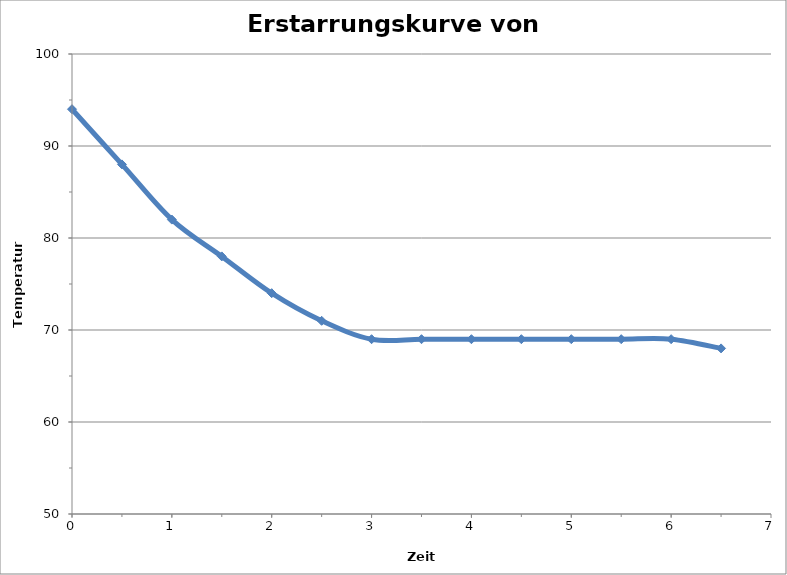
| Category | Temperatur [°C] |
|---|---|
| 0.0 | 94 |
| 0.5 | 88 |
| 1.0 | 82 |
| 1.5 | 78 |
| 2.0 | 74 |
| 2.5 | 71 |
| 3.0 | 69 |
| 3.5 | 69 |
| 4.0 | 69 |
| 4.5 | 69 |
| 5.0 | 69 |
| 5.5 | 69 |
| 6.0 | 69 |
| 6.5 | 68 |